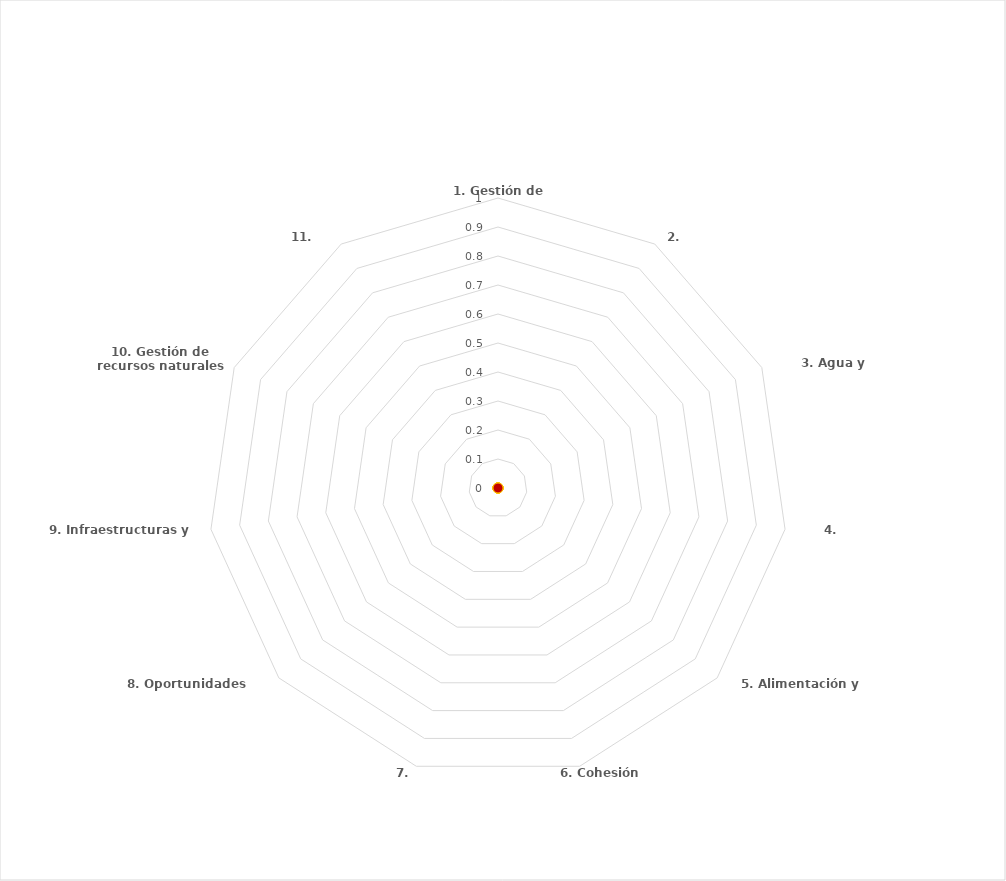
| Category | Series 0 | Series 1 | Series 2 | Series 3 |
|---|---|---|---|---|
| 1. Gestión de riesgos |  |  |  | 0 |
| 2. Salud |  |  |  | 0 |
| 3. Agua y saneamiento |  |  |  | 0 |
| 4. Alojamiento |  |  |  | 0 |
| 5. Alimentación y nutrición |  |  |  | 0 |
| 6. Cohesión social |  |  |  | 0 |
| 7. Inclusión |  |  |  | 0 |
| 8. Oportunidades económicas |  |  |  | 0 |
| 9. Infraestructuras y servicios |  |  |  | 0 |
| 10. Gestión de recursos naturales |  |  |  | 0 |
| 11. Conectividad |  |  |  | 0 |